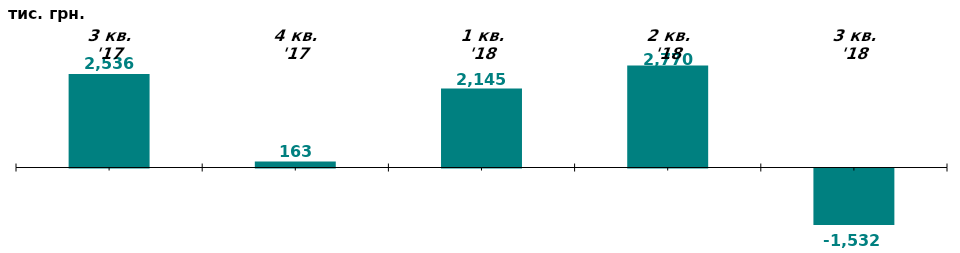
| Category | Чистий притік/відтік капіталу у 3-му кв. 2017-2018 рр., тис. грн. |
|---|---|
| 3 кв. '17 | 2536.489 |
| 4 кв. '17 | 162.522 |
| 1 кв. '18 | 2145.214 |
| 2 кв. '18 | 2770.106 |
| 3 кв. '18 | -1531.644 |